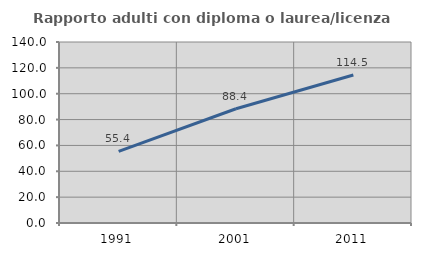
| Category | Rapporto adulti con diploma o laurea/licenza media  |
|---|---|
| 1991.0 | 55.411 |
| 2001.0 | 88.358 |
| 2011.0 | 114.503 |